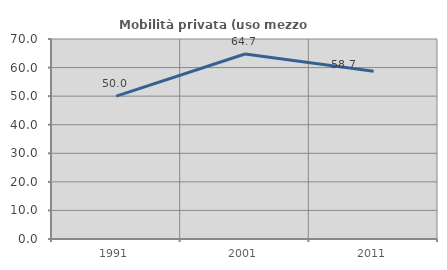
| Category | Mobilità privata (uso mezzo privato) |
|---|---|
| 1991.0 | 50 |
| 2001.0 | 64.748 |
| 2011.0 | 58.73 |